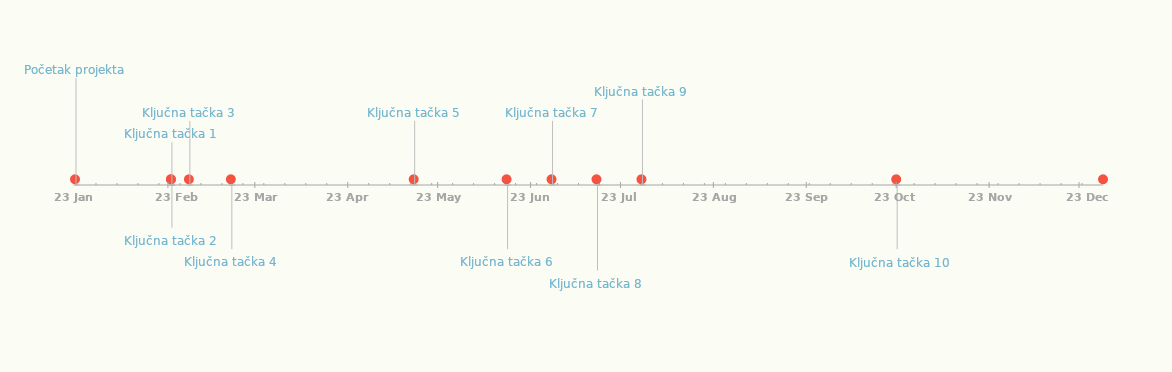
| Category | POLOŽAJ |
|---|---|
| Početak projekta | 25 |
| Ključna tačka 1 | 10 |
| Ključna tačka 2 | -10 |
| Ključna tačka 3 | 15 |
| Ključna tačka 4 | -15 |
| Ključna tačka 5 | 15 |
| Ključna tačka 6 | -15 |
| Ključna tačka 7 | 15 |
| Ključna tačka 8 | -20 |
| Ključna tačka 9 | 20 |
| Ključna tačka 10 | -15 |
| Završetak projekta | 15 |